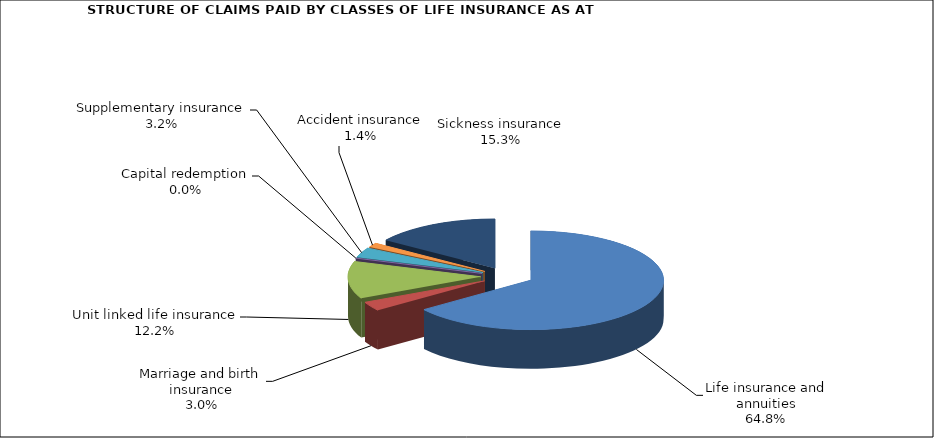
| Category | Series 0 |
|---|---|
| Life insurance and annuities | 85521238.655 |
| Marriage and birth insurance | 3951457.246 |
| Unit linked life insurance | 16092037.99 |
| Capital redemption | 0 |
| Supplementary insurance | 4255264.813 |
| Accident insurance | 1858174.194 |
| Sickness insurance | 20225042.005 |